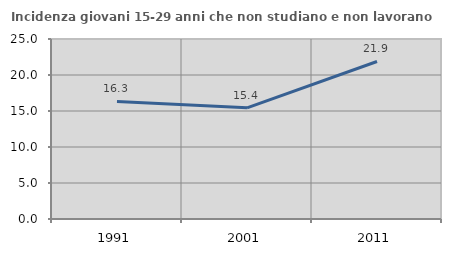
| Category | Incidenza giovani 15-29 anni che non studiano e non lavorano  |
|---|---|
| 1991.0 | 16.327 |
| 2001.0 | 15.441 |
| 2011.0 | 21.879 |